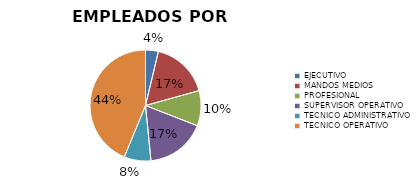
| Category | Series 0 |
|---|---|
| EJECUTIVO | 102 |
| MANDOS MEDIOS | 464 |
| PROFESIONAL | 280 |
| SUPERVISOR OPERATIVO | 479 |
| TECNICO ADMINISTRATIVO | 213 |
| TECNICO OPERATIVO | 1198 |